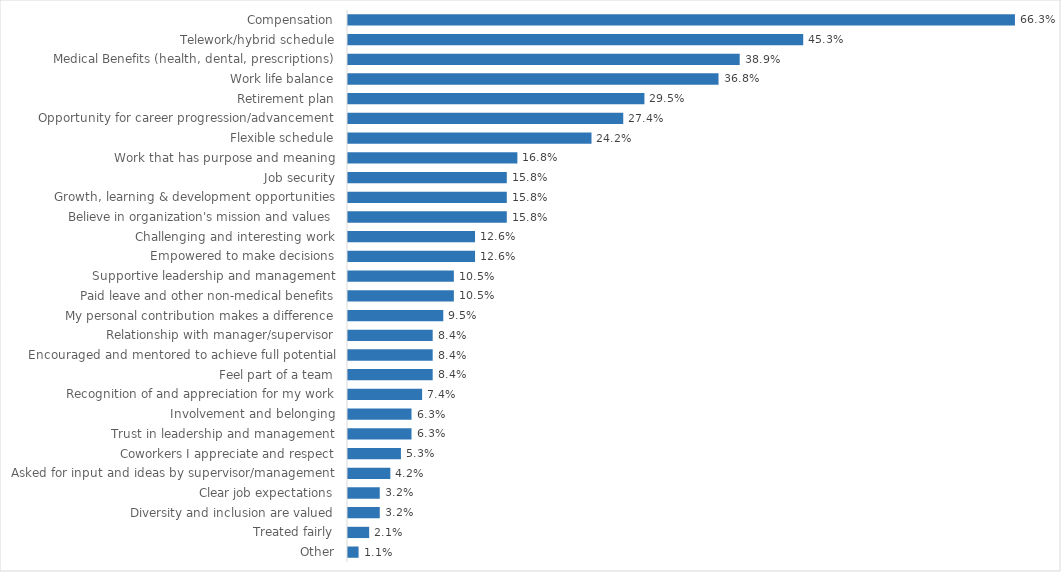
| Category | Human Resources |
|---|---|
| Compensation | 0.663 |
| Telework/hybrid schedule | 0.453 |
| Medical Benefits (health, dental, prescriptions) | 0.389 |
| Work life balance | 0.368 |
| Retirement plan | 0.295 |
| Opportunity for career progression/advancement | 0.274 |
| Flexible schedule | 0.242 |
| Work that has purpose and meaning | 0.168 |
| Job security | 0.158 |
| Growth, learning & development opportunities | 0.158 |
| Believe in organization's mission and values | 0.158 |
| Challenging and interesting work | 0.126 |
| Empowered to make decisions | 0.126 |
| Supportive leadership and management | 0.105 |
| Paid leave and other non-medical benefits | 0.105 |
| My personal contribution makes a difference | 0.095 |
| Relationship with manager/supervisor | 0.084 |
| Encouraged and mentored to achieve full potential | 0.084 |
| Feel part of a team | 0.084 |
| Recognition of and appreciation for my work | 0.074 |
| Involvement and belonging | 0.063 |
| Trust in leadership and management | 0.063 |
| Coworkers I appreciate and respect | 0.053 |
| Asked for input and ideas by supervisor/management | 0.042 |
| Clear job expectations | 0.032 |
| Diversity and inclusion are valued | 0.032 |
| Treated fairly | 0.021 |
| Other | 0.011 |